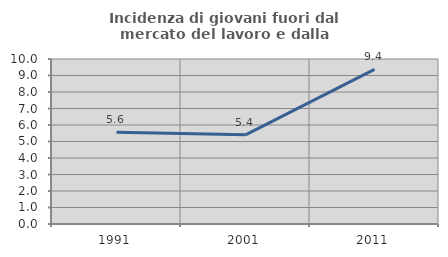
| Category | Incidenza di giovani fuori dal mercato del lavoro e dalla formazione  |
|---|---|
| 1991.0 | 5.556 |
| 2001.0 | 5.405 |
| 2011.0 | 9.375 |